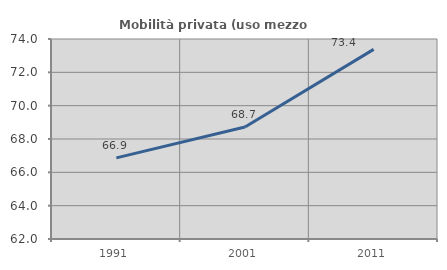
| Category | Mobilità privata (uso mezzo privato) |
|---|---|
| 1991.0 | 66.87 |
| 2001.0 | 68.721 |
| 2011.0 | 73.379 |